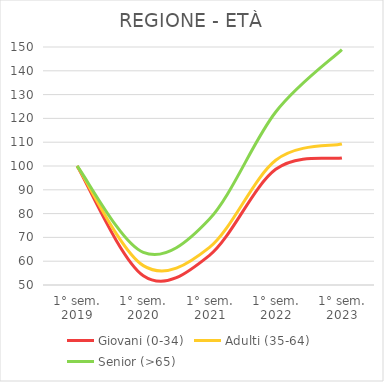
| Category | Giovani (0-34) | Adulti (35-64) | Senior (>65) |
|---|---|---|---|
| 1° sem.
2019 | 100 | 100 | 100 |
| 1° sem.
2020 | 53.923 | 58.147 | 63.708 |
| 1° sem.
2021 | 62.473 | 65.8 | 77.712 |
| 1° sem.
2022 | 98.625 | 102.418 | 122.682 |
| 1° sem.
2023 | 103.363 | 109.26 | 148.915 |